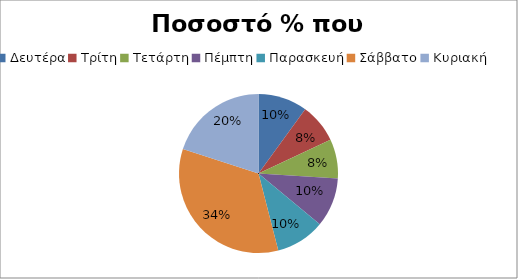
| Category | Ποσοστό % που ξόδεψαν |
|---|---|
| Δευτέρα | 0.1 |
| Τρίτη | 0.08 |
| Τετάρτη | 0.08 |
| Πέμπτη | 0.1 |
| Παρασκευή | 0.1 |
| Σάββατο | 0.34 |
| Κυριακή | 0.2 |